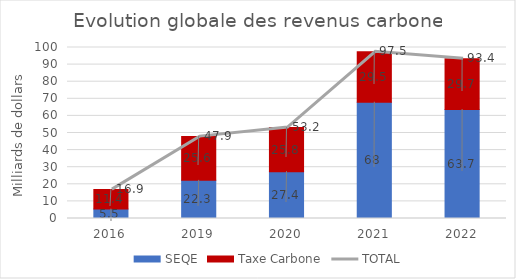
| Category | SEQE | Taxe Carbone |
|---|---|---|
| 2016.0 | 5.5 | 11.4 |
| 2019.0 | 22.3 | 25.6 |
| 2020.0 | 27.4 | 25.8 |
| 2021.0 | 68 | 29.5 |
| 2022.0 | 63.7 | 29.7 |